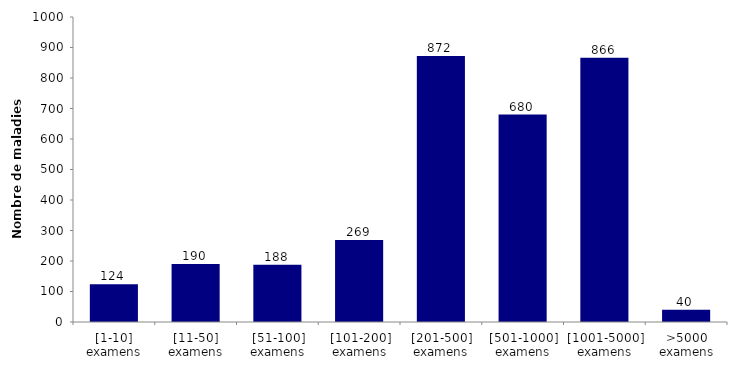
| Category | Nombre d'examens |
|---|---|
| [1-10] examens | 124 |
| [11-50] examens | 190 |
| [51-100] examens | 188 |
| [101-200] examens | 269 |
| [201-500] examens | 872 |
| [501-1000] examens | 680 |
| [1001-5000] examens | 866 |
| >5000 examens | 40 |